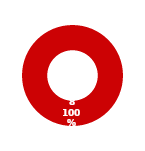
| Category | ACCESS |
|---|---|
| MIL 1 Complete | 0 |
| MIL 1 Not Complete | 8 |